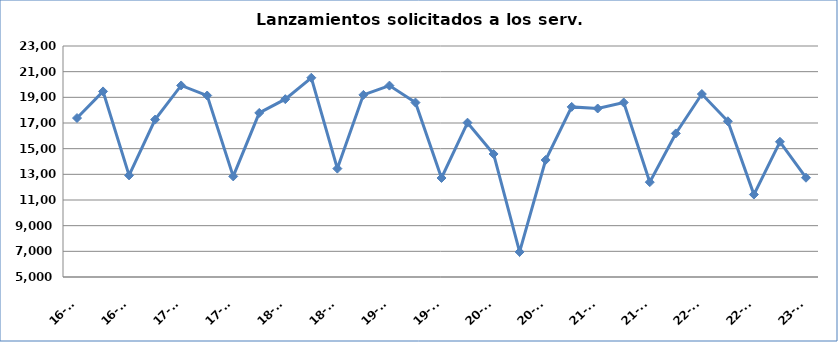
| Category | Series 0 |
|---|---|
| 16-T1 | 17386 |
| 16-T2 | 19461 |
| 16-T3 | 12918 |
| 16-T4 | 17265 |
| 17-T1 | 19926 |
| 17-T2 | 19141 |
| 17-T3 | 12840 |
| 17-T4 | 17786 |
| 18-T1 | 18859 |
| 18-T2 | 20526 |
| 18-T3 | 13446 |
| 18-T4 | 19192 |
| 19-T1 | 19913 |
| 19-T2 | 18594 |
| 19-T3 | 12715 |
| 19-T4 | 17025 |
| 20-T1 | 14586 |
| 20-T2 | 6953 |
| 20-T3 | 14117 |
| 20-T4 | 18255 |
| 21-T1 | 18131 |
| 21-T2 | 18598 |
| 21-T3 | 12390 |
| 21-T4 | 16187 |
| 22-T1 | 19257 |
| 22-T2 | 17134 |
| 22-T3 | 11425 |
| 22-T4 | 15536 |
| 23-T1 | 12736 |